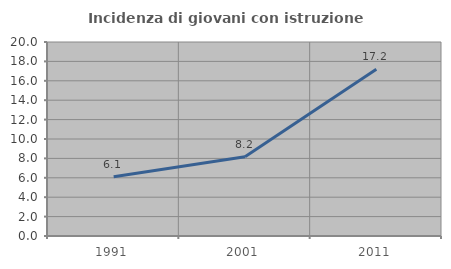
| Category | Incidenza di giovani con istruzione universitaria |
|---|---|
| 1991.0 | 6.104 |
| 2001.0 | 8.171 |
| 2011.0 | 17.194 |